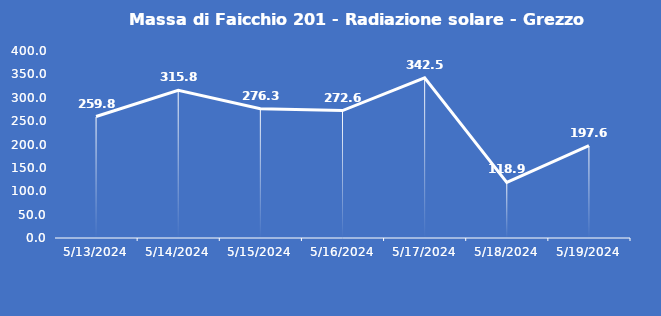
| Category | Massa di Faicchio 201 - Radiazione solare - Grezzo (W/m2) |
|---|---|
| 5/13/24 | 259.8 |
| 5/14/24 | 315.8 |
| 5/15/24 | 276.3 |
| 5/16/24 | 272.6 |
| 5/17/24 | 342.5 |
| 5/18/24 | 118.9 |
| 5/19/24 | 197.6 |